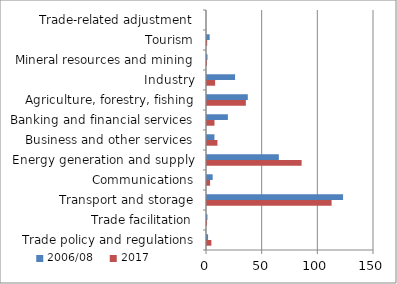
| Category | 2017 | 2006/08 |
|---|---|---|
| Trade policy and regulations | 3.924 | 0.969 |
| Trade facilitation | 0.041 | 0.392 |
| Transport and storage | 111.909 | 122.229 |
| Communications | 2.742 | 5.093 |
| Energy generation and supply | 84.979 | 64.513 |
| Business and other services | 9.374 | 6.694 |
| Banking and financial services | 6.721 | 18.771 |
| Agriculture, forestry, fishing | 34.912 | 36.645 |
| Industry | 7.3 | 25.225 |
| Mineral resources and mining | 0.016 | 0.448 |
| Tourism | 0.156 | 2.405 |
| Trade-related adjustment | 0 | 0 |